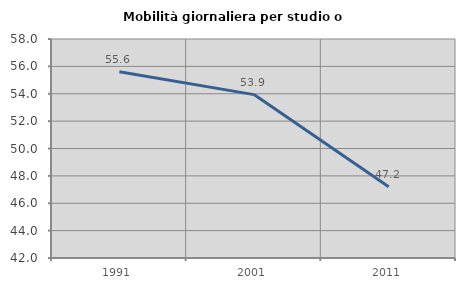
| Category | Mobilità giornaliera per studio o lavoro |
|---|---|
| 1991.0 | 55.6 |
| 2001.0 | 53.937 |
| 2011.0 | 47.21 |